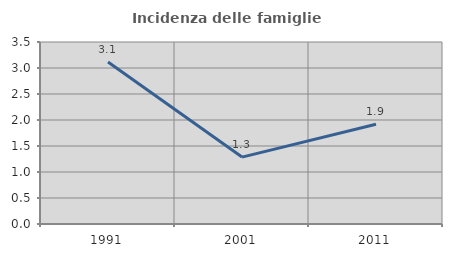
| Category | Incidenza delle famiglie numerose |
|---|---|
| 1991.0 | 3.117 |
| 2001.0 | 1.287 |
| 2011.0 | 1.919 |